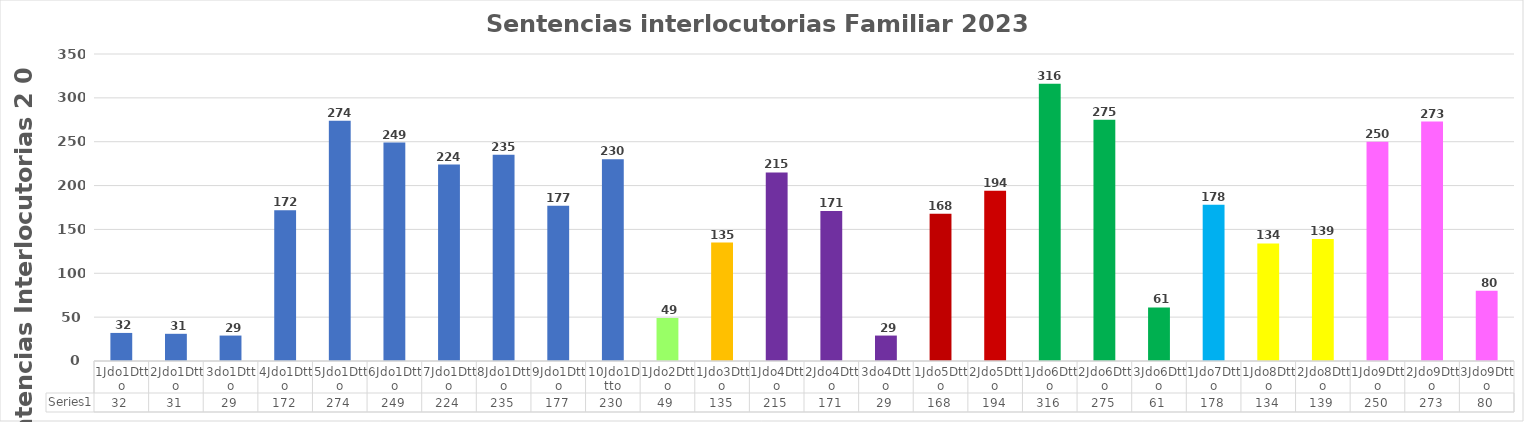
| Category | Series 0 |
|---|---|
| 1Jdo1Dtto | 32 |
| 2Jdo1Dtto | 31 |
| 3do1Dtto | 29 |
| 4Jdo1Dtto | 172 |
| 5Jdo1Dtto | 274 |
| 6Jdo1Dtto | 249 |
| 7Jdo1Dtto | 224 |
| 8Jdo1Dtto | 235 |
| 9Jdo1Dtto | 177 |
| 10Jdo1Dtto | 230 |
| 1Jdo2Dtto | 49 |
| 1Jdo3Dtto | 135 |
| 1Jdo4Dtto | 215 |
| 2Jdo4Dtto | 171 |
| 3do4Dtto | 29 |
| 1Jdo5Dtto | 168 |
| 2Jdo5Dtto | 194 |
| 1Jdo6Dtto | 316 |
| 2Jdo6Dtto | 275 |
| 3Jdo6Dtto | 61 |
| 1Jdo7Dtto | 178 |
| 1Jdo8Dtto | 134 |
| 2Jdo8Dtto | 139 |
| 1Jdo9Dtto | 250 |
| 2Jdo9Dtto | 273 |
| 3Jdo9Dtto | 80 |